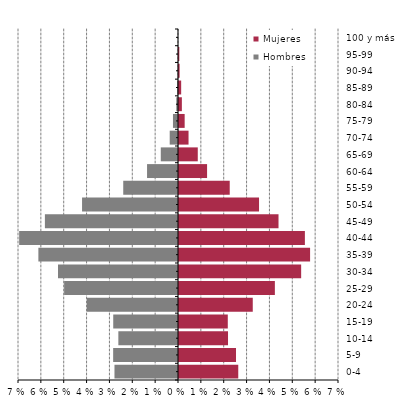
| Category | Hombres | Mujeres |
|---|---|---|
| 0-4 | -0.028 | 0.026 |
| 5-9 | -0.028 | 0.025 |
| 10-14 | -0.026 | 0.021 |
| 15-19 | -0.028 | 0.021 |
| 20-24 | -0.04 | 0.032 |
| 25-29 | -0.05 | 0.042 |
| 30-34 | -0.052 | 0.053 |
| 35-39 | -0.061 | 0.057 |
| 40-44 | -0.069 | 0.055 |
| 45-49 | -0.058 | 0.044 |
| 50-54 | -0.042 | 0.035 |
| 55-59 | -0.024 | 0.022 |
| 60-64 | -0.014 | 0.012 |
| 65-69 | -0.008 | 0.008 |
| 70-74 | -0.004 | 0.004 |
| 75-79 | -0.002 | 0.002 |
| 80-84 | -0.001 | 0.001 |
| 85-89 | 0 | 0.001 |
| 90-94 | 0 | 0 |
| 95-99 | 0 | 0 |
| 100 y más | 0 | 0 |